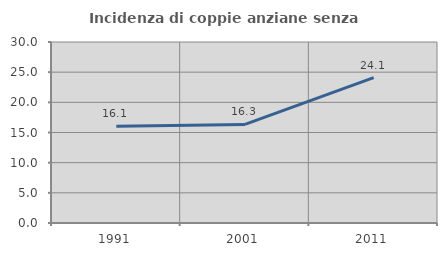
| Category | Incidenza di coppie anziane senza figli  |
|---|---|
| 1991.0 | 16.055 |
| 2001.0 | 16.346 |
| 2011.0 | 24.088 |